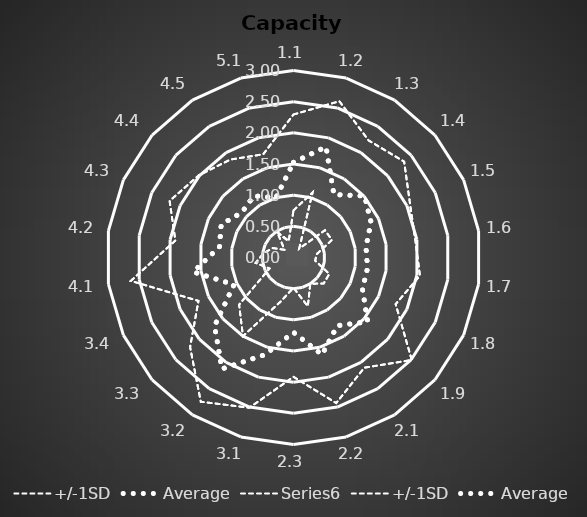
| Category | +/-1SD | Average | Series 5 | Series 2 |
|---|---|---|---|---|
| 1.1 | 2.294 | 1.525 | 0.756 | 0.756 |
| 1.2 | 2.613 | 1.85 | 1.087 | 1.087 |
| 1.3 | 2.231 | 1.2 | 0.169 | 0.169 |
| 1.4 | 2.349 | 1.508 | 0.668 | 0.668 |
| 1.5 | 2.056 | 1.367 | 0.677 | 0.677 |
| 1.6 | 1.974 | 1.175 | 0.376 | 0.376 |
| 1.7 | 2.049 | 1.2 | 0.351 | 0.351 |
| 1.8 | 1.802 | 1.217 | 0.632 | 0.632 |
| 1.9 | 2.511 | 1.575 | 0.639 | 0.639 |
| 2.1 | 2.101 | 1.3 | 0.499 | 0.499 |
| 2.2 | 2.434 | 1.625 | 0.816 | 0.816 |
| 2.3 | 1.915 | 1.2 | 0.485 | 0.485 |
| 3.1 | 2.512 | 1.625 | 0.738 | 0.738 |
| 3.2 | 2.751 | 2.125 | 1.499 | 1.499 |
| 3.3 | 2.195 | 1.675 | 1.155 | 1.155 |
| 3.4 | 1.676 | 1.05 | 0.424 | 0.424 |
| 4.1 | 2.636 | 1.625 | 0.614 | 0.614 |
| 4.2 | 1.915 | 1.2 | 0.485 | 0.485 |
| 4.3 | 2.185 | 1.275 | 0.365 | 0.365 |
| 4.4 | 2.012 | 1.1 | 0.188 | 0.188 |
| 4.5 | 1.868 | 1.175 | 0.482 | 0.482 |
| 5.1 | 1.725 | 1 | 0.275 | 0.275 |